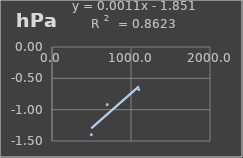
| Category | Presión Atmosférica |
|---|---|
| 497.8 | -1.4 |
| 698.2 | -0.92 |
| 1098.8 | -0.68 |